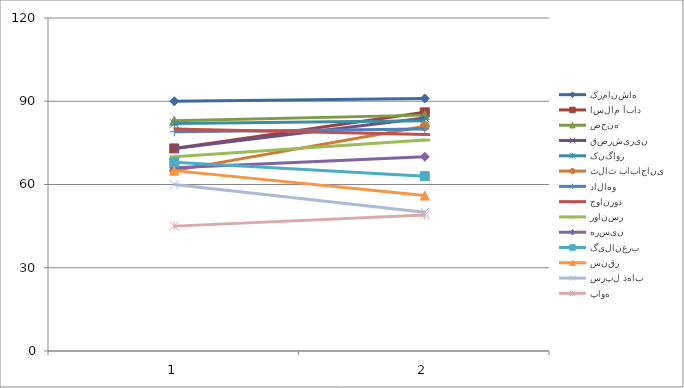
| Category | کرمانشاه | اسلام آباد | صحنه | قصرشیرین | کنگاور | ثلاث باباجانی | دالاهو | جوانرود | روانسر | هرسین | گیلانغرب | سنقر | سرپل ذهاب | پاوه |
|---|---|---|---|---|---|---|---|---|---|---|---|---|---|---|
| 0 | 90 | 73 | 83 | 73 | 82 | 65 | 79 | 80 | 70 | 66 | 68 | 65 | 60 | 45 |
| 1 | 91 | 86 | 85 | 84 | 83 | 81 | 80 | 78 | 76 | 70 | 63 | 56 | 50 | 49 |